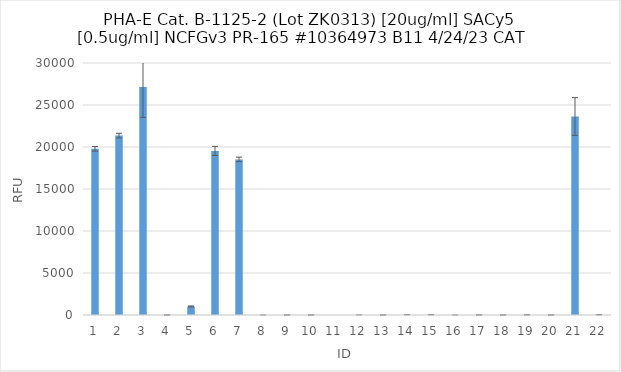
| Category | RFU |
|---|---|
| 0 | 19778.25 |
| 1 | 21356.75 |
| 2 | 27134.5 |
| 3 | 2.5 |
| 4 | 1016.75 |
| 5 | 19534.25 |
| 6 | 18526.25 |
| 7 | 0.25 |
| 8 | -0.25 |
| 9 | 1 |
| 10 | -66 |
| 11 | 3.25 |
| 12 | -0.75 |
| 13 | -30.75 |
| 14 | -26.25 |
| 15 | 0.5 |
| 16 | 4.5 |
| 17 | 1 |
| 18 | -25 |
| 19 | -0.25 |
| 20 | 23631.75 |
| 21 | 37.5 |